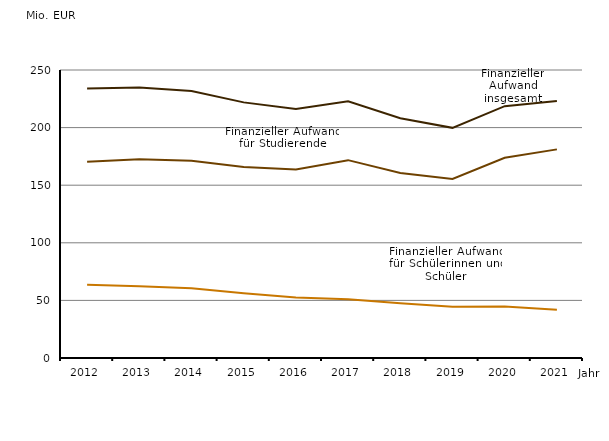
| Category | Finanzieller Aufwand
insgesamt | Finanzieller Aufwand
für Schülerinnen und Schüler | Finanzieller Aufwand 
für Studierende  |
|---|---|---|---|
| 2012.0 | 234.024 | 63.655 | 170.363 |
| 2013.0 | 234.879 | 62.328 | 172.551 |
| 2014.0 | 231.776 | 60.619 | 171.156 |
| 2015.0 | 221.886 | 56.138 | 165.748 |
| 2016.0 | 216.247 | 52.599 | 163.648 |
| 2017.0 | 222.845 | 51.098 | 171.747 |
| 2018.0 | 208.157 | 47.481 | 160.676 |
| 2019.0 | 199.781 | 44.384 | 155.398 |
| 2020.0 | 218.577 | 44.78 | 173.797 |
| 2021.0 | 222.996 | 41.903 | 181.093 |